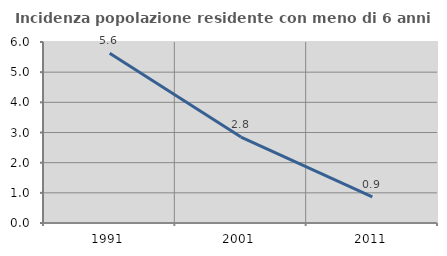
| Category | Incidenza popolazione residente con meno di 6 anni |
|---|---|
| 1991.0 | 5.631 |
| 2001.0 | 2.85 |
| 2011.0 | 0.87 |